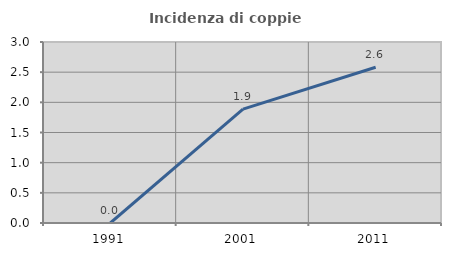
| Category | Incidenza di coppie miste |
|---|---|
| 1991.0 | 0 |
| 2001.0 | 1.887 |
| 2011.0 | 2.581 |